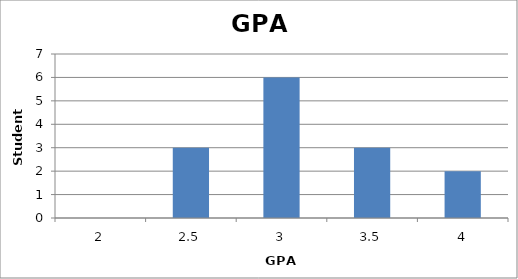
| Category | Series 0 |
|---|---|
| 2.0 | 0 |
| 2.5 | 3 |
| 3.0 | 6 |
| 3.5 | 3 |
| 4.0 | 2 |